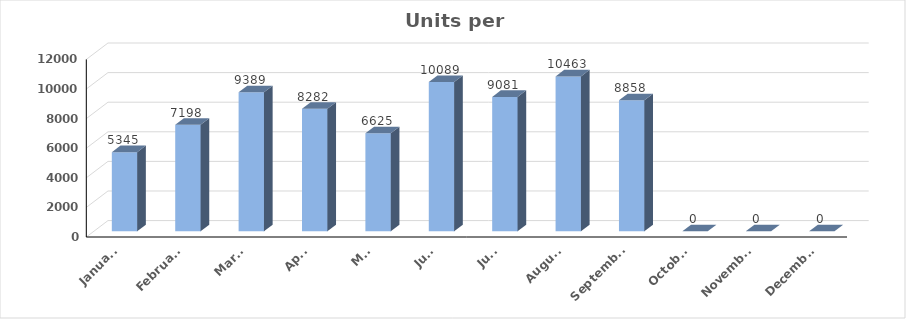
| Category | Units |
|---|---|
| January | 5345 |
| February | 7198 |
| March | 9389 |
| April | 8282 |
| May | 6625 |
| June | 10089 |
| July | 9081 |
| August | 10463 |
| September | 8858 |
| October | 0 |
| November | 0 |
| December | 0 |